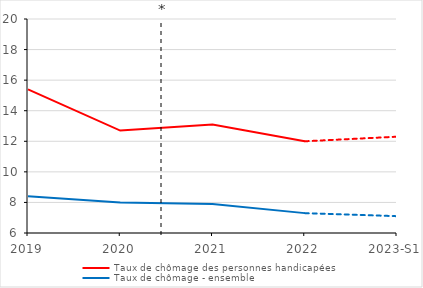
| Category | Taux de chômage des personnes handicapées | Taux de chômage - ensemble |
|---|---|---|
| 2019 | 15.4 | 8.4 |
| 2020 | 12.7 | 8 |
| 2021 | 13.1 | 7.9 |
| 2022 | 12 | 7.3 |
| 2023-S1 | 12.3 | 7.1 |